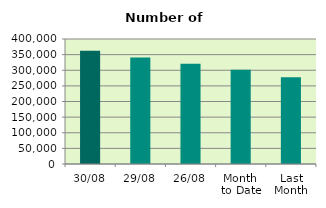
| Category | Series 0 |
|---|---|
| 30/08 | 362344 |
| 29/08 | 341036 |
| 26/08 | 320916 |
| Month 
to Date | 301668.091 |
| Last
Month | 277312.476 |